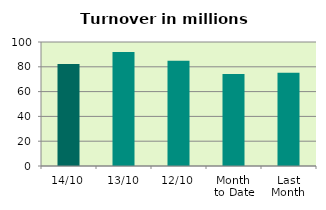
| Category | Series 0 |
|---|---|
| 14/10 | 82.333 |
| 13/10 | 92.019 |
| 12/10 | 84.873 |
| Month 
to Date | 74.109 |
| Last
Month | 75.235 |